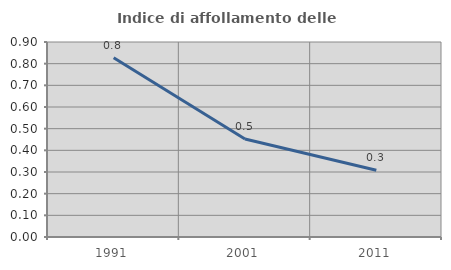
| Category | Indice di affollamento delle abitazioni  |
|---|---|
| 1991.0 | 0.827 |
| 2001.0 | 0.452 |
| 2011.0 | 0.308 |